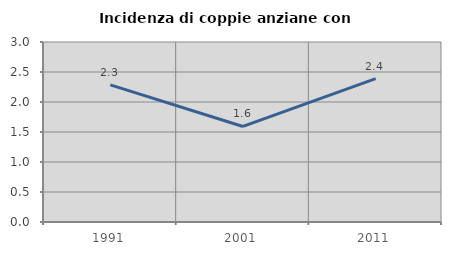
| Category | Incidenza di coppie anziane con figli |
|---|---|
| 1991.0 | 2.285 |
| 2001.0 | 1.592 |
| 2011.0 | 2.39 |